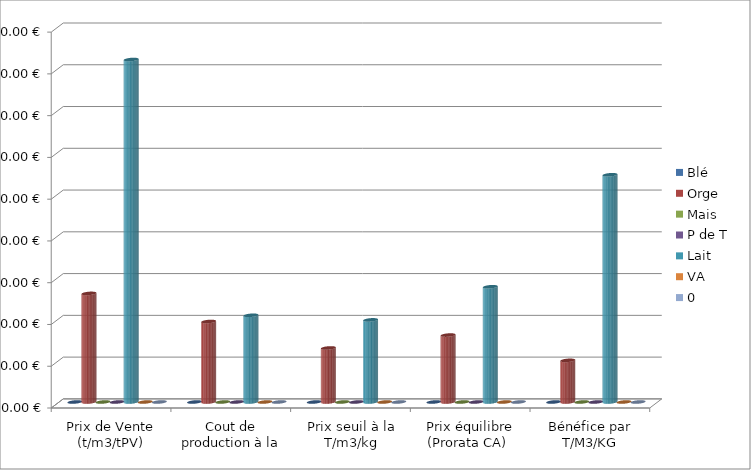
| Category | Blé  | Orge | Mais  | P de T  | Lait  | VA  | 0 |
|---|---|---|---|---|---|---|---|
| Prix de Vente (t/m3/tPV) | 0 | 130 | 0 | 0 | 410 | 0 | 0 |
| Cout de production à la T/m3/ Kg  | 0 | 96.367 | 0 | 0 | 103.806 | 0 | 0 |
| Prix seuil à la T/m3/kg | 0 | 64.701 | 0 | 0 | 98.306 | 0 | 0 |
| Prix équilibre (Prorata CA)  | 0 | 80.132 | 0 | 0 | 137.966 | 0 | 0 |
| Bénéfice par T/M3/KG | 0 | 49.868 | 0 | 0 | 272.034 | 0 | 0 |